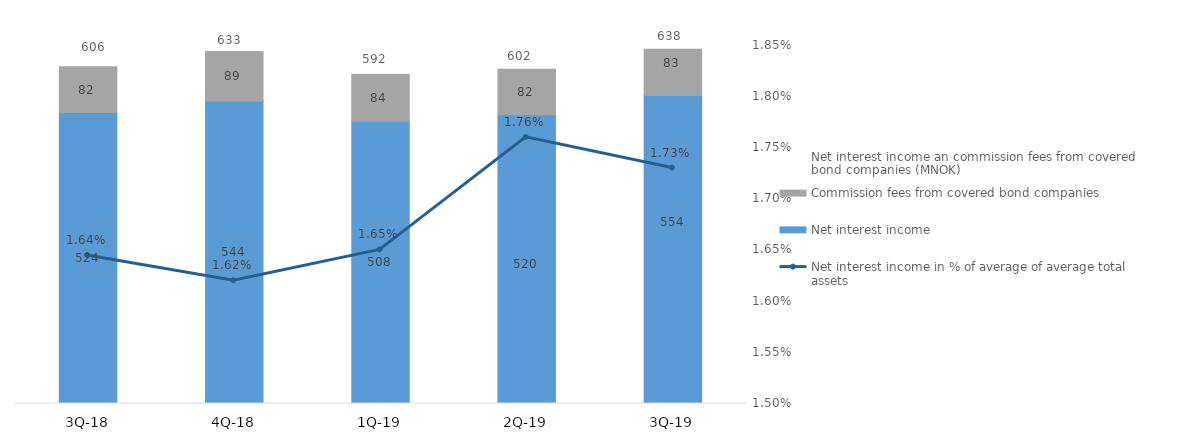
| Category | Net interest income | Commission fees from covered bond companies |
|---|---|---|
| 3Q-19 | 554.269 | 83.345 |
| 2Q-19 | 519.574 | 82.097 |
| 1Q-19 | 508 | 84.154 |
| 4Q-18 | 544.319 | 88.946 |
| 3Q-18 | 523.866 | 81.903 |